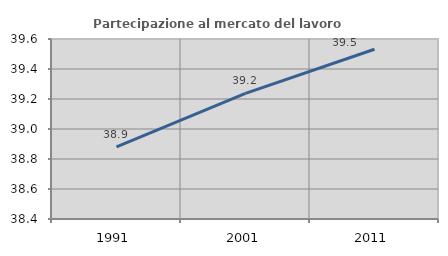
| Category | Partecipazione al mercato del lavoro  femminile |
|---|---|
| 1991.0 | 38.88 |
| 2001.0 | 39.238 |
| 2011.0 | 39.532 |